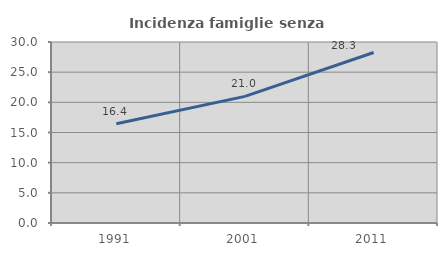
| Category | Incidenza famiglie senza nuclei |
|---|---|
| 1991.0 | 16.443 |
| 2001.0 | 20.986 |
| 2011.0 | 28.264 |